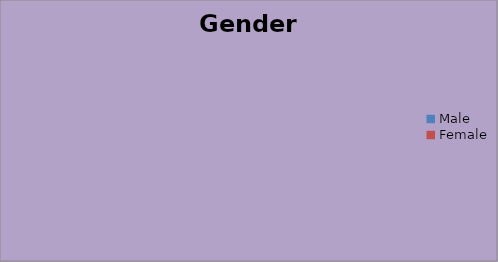
| Category | Gender |
|---|---|
| Male | 0 |
| Female | 0 |